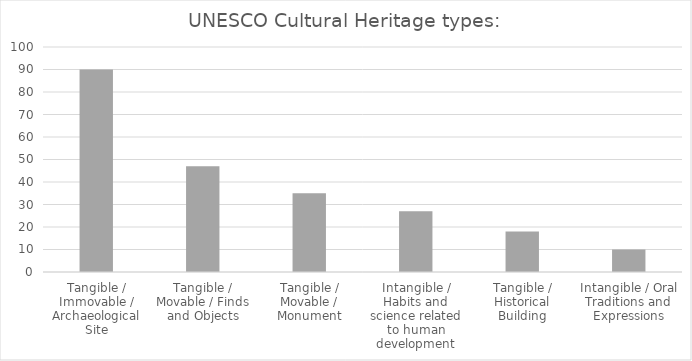
| Category | Number |
|---|---|
| Tangible / Immovable / Archaeological Site | 90 |
| Tangible / Movable / Finds and Objects | 47 |
| Tangible / Movable / Monument | 35 |
| Intangible / Habits and science related to human development | 27 |
| Tangible / Historical Building | 18 |
| Intangible / Oral Traditions and Expressions | 10 |